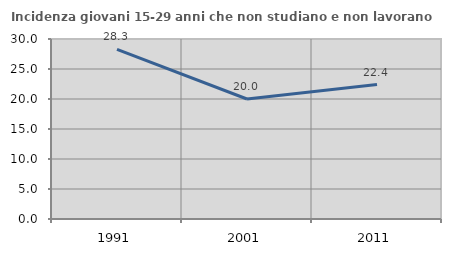
| Category | Incidenza giovani 15-29 anni che non studiano e non lavorano  |
|---|---|
| 1991.0 | 28.261 |
| 2001.0 | 20 |
| 2011.0 | 22.408 |